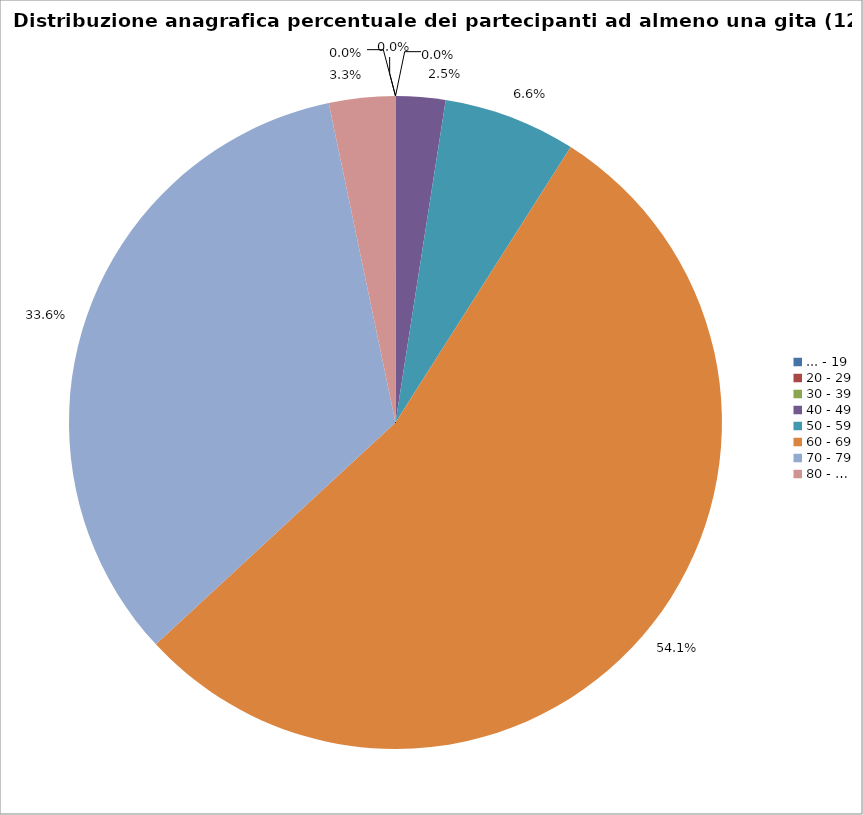
| Category | Nr. Tesserati |
|---|---|
| ... - 19 | 0 |
| 20 - 29 | 0 |
| 30 - 39 | 0 |
| 40 - 49 | 3 |
| 50 - 59 | 8 |
| 60 - 69 | 66 |
| 70 - 79 | 41 |
| 80 - … | 4 |